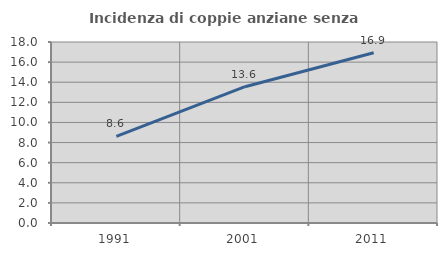
| Category | Incidenza di coppie anziane senza figli  |
|---|---|
| 1991.0 | 8.616 |
| 2001.0 | 13.554 |
| 2011.0 | 16.927 |